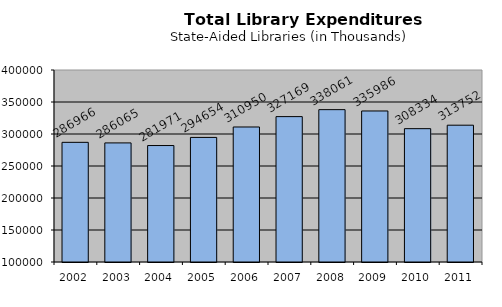
| Category | Series 0 |
|---|---|
| 2002.0 | 286966 |
| 2003.0 | 286065 |
| 2004.0 | 281971 |
| 2005.0 | 294654 |
| 2006.0 | 310950 |
| 2007.0 | 327169 |
| 2008.0 | 338061 |
| 2009.0 | 335986 |
| 2010.0 | 308334 |
| 2011.0 | 313752 |